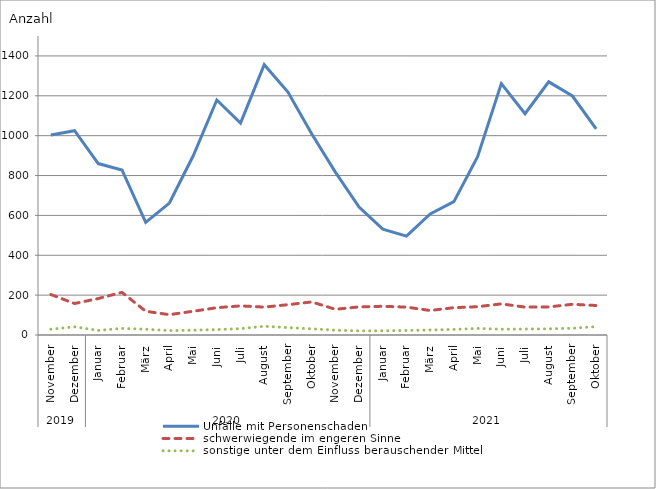
| Category | Unfälle mit Personenschaden | schwerwiegende im engeren Sinne | sonstige unter dem Einfluss berauschender Mittel |
|---|---|---|---|
| 0 | 1003 | 203 | 29 |
| 1 | 1025 | 158 | 41 |
| 2 | 860 | 183 | 23 |
| 3 | 828 | 214 | 33 |
| 4 | 565 | 119 | 29 |
| 5 | 662 | 102 | 22 |
| 6 | 898 | 119 | 24 |
| 7 | 1179 | 137 | 27 |
| 8 | 1063 | 146 | 32 |
| 9 | 1356 | 140 | 44 |
| 10 | 1219 | 152 | 37 |
| 11 | 1010 | 166 | 31 |
| 12 | 817 | 129 | 24 |
| 13 | 642 | 141 | 21 |
| 14 | 531 | 144 | 21 |
| 15 | 496 | 140 | 23 |
| 16 | 607 | 123 | 25 |
| 17 | 669 | 137 | 28 |
| 18 | 895 | 142 | 33 |
| 19 | 1261 | 156 | 29 |
| 20 | 1110 | 140 | 30 |
| 21 | 1270 | 141 | 31 |
| 22 | 1199 | 154 | 34 |
| 23 | 1034 | 148 | 42 |